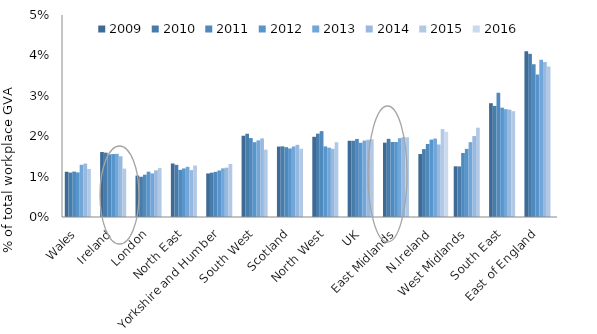
| Category | 2009 | 2010 | 2011 | 2012 | 2013 | 2014 | 2015 | 2016 |
|---|---|---|---|---|---|---|---|---|
| Wales | 0.011 | 0.011 | 0.011 | 0.011 | 0.013 | 0.013 | 0.012 | 0 |
| Ireland | 0.016 | 0.016 | 0.016 | 0.016 | 0.016 | 0.015 | 0.012 | 0 |
| London | 0.01 | 0.01 | 0.01 | 0.011 | 0.011 | 0.012 | 0.012 | 0 |
| North East | 0.013 | 0.013 | 0.012 | 0.012 | 0.012 | 0.012 | 0.013 | 0 |
| Yorkshire and Humber | 0.011 | 0.011 | 0.011 | 0.012 | 0.012 | 0.012 | 0.013 | 0 |
| South West | 0.02 | 0.021 | 0.02 | 0.019 | 0.019 | 0.019 | 0.017 | 0 |
| Scotland | 0.017 | 0.017 | 0.017 | 0.017 | 0.017 | 0.018 | 0.017 | 0 |
| North West | 0.02 | 0.021 | 0.021 | 0.017 | 0.017 | 0.017 | 0.019 | 0 |
| UK | 0.019 | 0.019 | 0.019 | 0.018 | 0.019 | 0.019 | 0.019 | 0 |
| East Midlands | 0.018 | 0.019 | 0.019 | 0.019 | 0.02 | 0.02 | 0.02 | 0 |
| N.Ireland | 0.016 | 0.017 | 0.018 | 0.019 | 0.019 | 0.018 | 0.022 | 0.021 |
| West Midlands | 0.013 | 0.013 | 0.016 | 0.017 | 0.019 | 0.02 | 0.022 | 0 |
| South East | 0.028 | 0.027 | 0.031 | 0.027 | 0.027 | 0.027 | 0.026 | 0 |
| East of England | 0.041 | 0.04 | 0.038 | 0.035 | 0.039 | 0.038 | 0.037 | 0 |